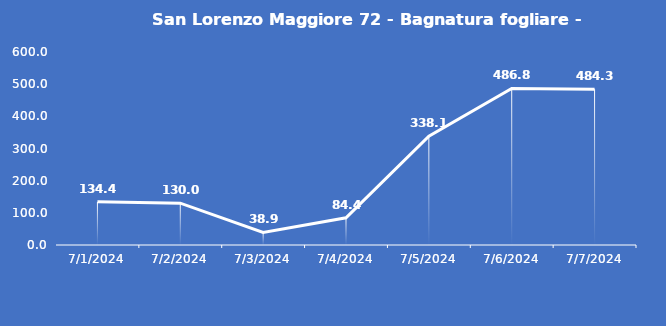
| Category | San Lorenzo Maggiore 72 - Bagnatura fogliare - Grezzo (min) |
|---|---|
| 7/1/24 | 134.4 |
| 7/2/24 | 130 |
| 7/3/24 | 38.9 |
| 7/4/24 | 84.4 |
| 7/5/24 | 338.1 |
| 7/6/24 | 486.8 |
| 7/7/24 | 484.3 |